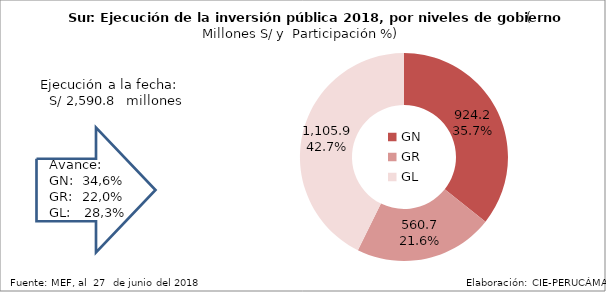
| Category | Ejecutado |
|---|---|
| GN | 924.203 |
| GR | 560.744 |
| GL | 1105.883 |